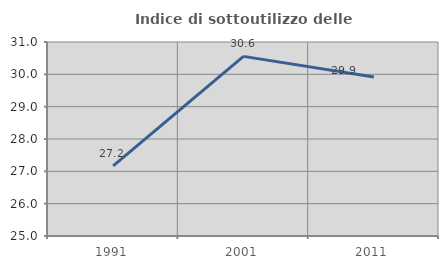
| Category | Indice di sottoutilizzo delle abitazioni  |
|---|---|
| 1991.0 | 27.168 |
| 2001.0 | 30.556 |
| 2011.0 | 29.915 |